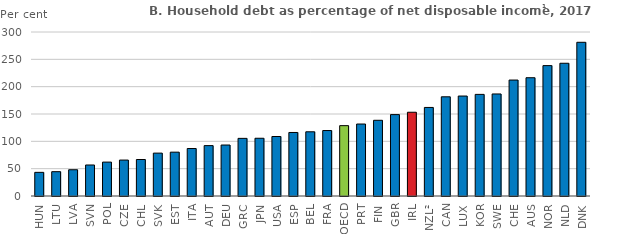
| Category | Series 0 |
|---|---|
| HUN | 43.258 |
| LTU | 44.49 |
| LVA | 48.021 |
| SVN | 56.726 |
| POL | 62.015 |
| CZE | 65.718 |
| CHL | 66.748 |
| SVK | 78.457 |
| EST | 80.188 |
| ITA | 86.847 |
| AUT | 92.177 |
| DEU | 93.252 |
| GRC | 105.415 |
| JPN | 105.634 |
| USA | 108.82 |
| ESP | 116.214 |
| BEL | 117.451 |
| FRA | 119.738 |
| OECD | 128.684 |
| PRT | 131.662 |
| FIN | 138.481 |
| GBR | 148.894 |
| IRL | 153.213 |
| NZL² | 162 |
| CAN | 181.443 |
| LUX | 182.865 |
| KOR | 185.875 |
| SWE | 186.671 |
| CHE | 212.093 |
| AUS | 216.361 |
| NOR | 238.504 |
| NLD | 242.83 |
| DNK | 281.181 |